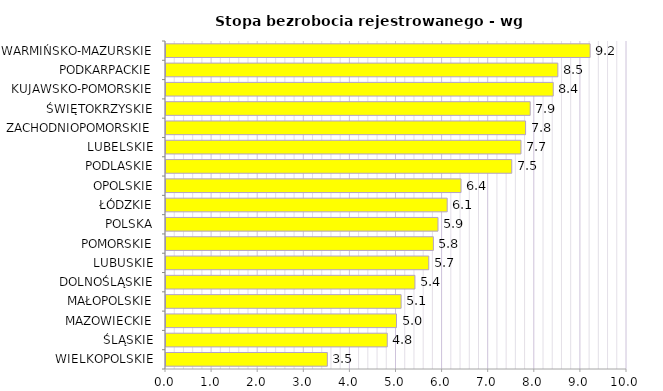
| Category | Stopa bezrobocia rejestrowanego - wg województw |
|---|---|
| WIELKOPOLSKIE | 3.5 |
| ŚLĄSKIE | 4.8 |
| MAZOWIECKIE | 5 |
| MAŁOPOLSKIE | 5.1 |
| DOLNOŚLĄSKIE | 5.4 |
| LUBUSKIE | 5.7 |
| POMORSKIE | 5.8 |
| POLSKA | 5.9 |
| ŁÓDZKIE | 6.1 |
| OPOLSKIE | 6.4 |
| PODLASKIE | 7.5 |
| LUBELSKIE | 7.7 |
| ZACHODNIOPOMORSKIE | 7.8 |
| ŚWIĘTOKRZYSKIE | 7.9 |
| KUJAWSKO-POMORSKIE | 8.4 |
| PODKARPACKIE | 8.5 |
| WARMIŃSKO-MAZURSKIE | 9.2 |